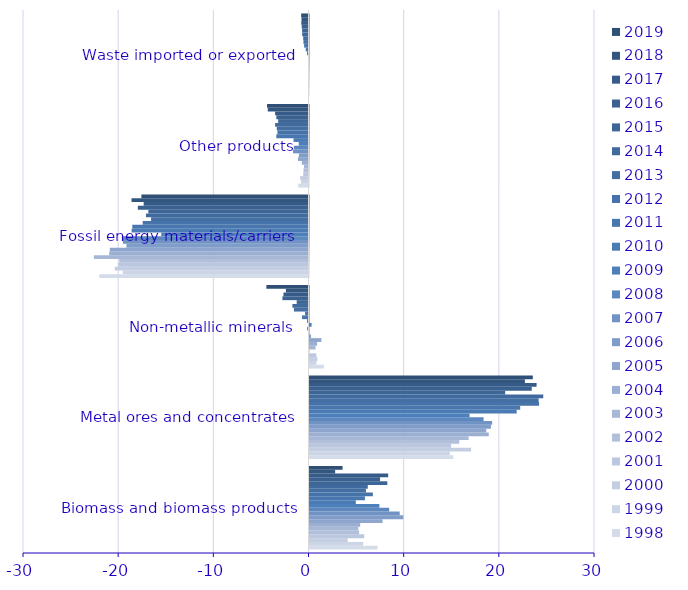
| Category | 1998 | 1999 | 2000 | 2001 | 2002 | 2003 | 2004 | 2005 | 2006 | 2007 | 2008 | 2009 | 2010 | 2011 | 2012 | 2013 | 2014 | 2015 | 2016 | 2017 | 2018 | 2019 |
|---|---|---|---|---|---|---|---|---|---|---|---|---|---|---|---|---|---|---|---|---|---|---|
| Biomass and biomass products | 7.155 | 5.646 | 4.006 | 5.745 | 5.214 | 5.129 | 5.324 | 7.68 | 9.854 | 9.479 | 8.37 | 7.344 | 4.868 | 5.828 | 6.657 | 5.93 | 6.124 | 8.178 | 7.418 | 8.266 | 2.696 | 3.474 |
| Metal ores and concentrates | 15.11 | 14.74 | 16.983 | 14.88 | 15.735 | 16.716 | 18.835 | 18.572 | 19.062 | 19.19 | 18.291 | 16.819 | 21.769 | 22.139 | 24.122 | 24.076 | 24.563 | 20.564 | 23.355 | 23.862 | 22.633 | 23.466 |
| Non-metallic minerals | 1.521 | 0.726 | 0.835 | 0.719 | -0.034 | 0.636 | 0.795 | 1.249 | 0.15 | 0.005 | -0.148 | 0.223 | -0.152 | -0.679 | -0.36 | -1.529 | -1.692 | -1.239 | -2.738 | -2.63 | -2.375 | -4.426 |
| Fossil energy materials/carriers | -21.988 | -19.506 | -20.354 | -19.978 | -19.893 | -22.552 | -20.945 | -20.876 | -19.131 | -19.5 | -19.543 | -15.474 | -18.591 | -18.518 | -17.422 | -16.543 | -17.077 | -16.83 | -17.935 | -17.319 | -18.599 | -17.559 |
| Other products | -1.083 | -0.784 | -0.882 | -0.553 | -0.531 | -0.472 | -0.702 | -1.108 | -1.006 | -1.629 | -1.537 | -1.024 | -1.573 | -3.384 | -3.263 | -3.334 | -3.507 | -3.187 | -3.379 | -3.511 | -4.279 | -4.357 |
| Waste imported or exported | 0 | 0 | 0 | 0 | -0.002 | -0.002 | -0.002 | -0.017 | -0.008 | -0.013 | -0.027 | -0.156 | -0.29 | -0.46 | -0.534 | -0.56 | -0.667 | -0.671 | -0.712 | -0.756 | -0.736 | -0.773 |